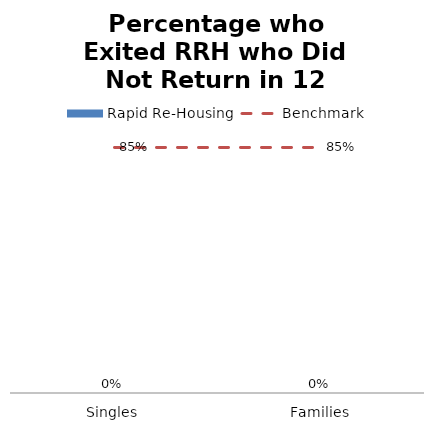
| Category | Rapid Re-Housing |
|---|---|
| Singles | 0 |
| Families | 0 |